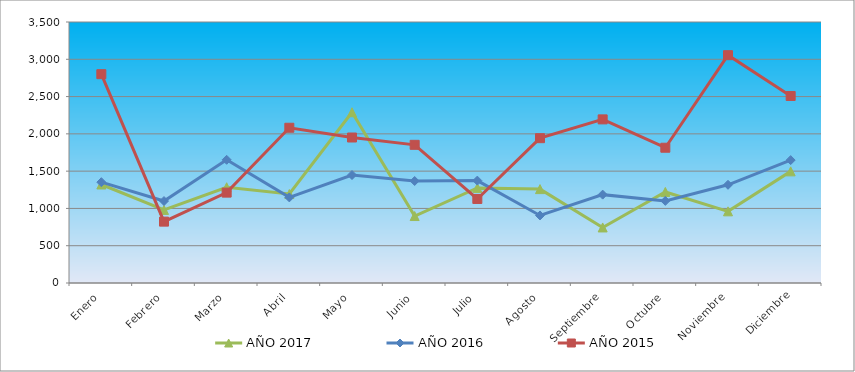
| Category | AÑO 2017 | AÑO 2016 | AÑO 2015 |
|---|---|---|---|
| Enero | 1321 | 1352 | 2800 |
| Febrero | 980 | 1099 | 823 |
| Marzo | 1284 | 1652 | 1212 |
| Abril | 1193 | 1148 | 2082 |
| Mayo | 2290 | 1448 | 1951 |
| Junio | 898 | 1368 | 1853 |
| Julio | 1275 | 1373 | 1127 |
| Agosto | 1259 | 906 | 1942 |
| Septiembre | 745 | 1185 | 2194 |
| Octubre | 1221 | 1101 | 1814 |
| Noviembre | 961 | 1317 | 3055 |
| Diciembre | 1497 | 1648 | 2508 |